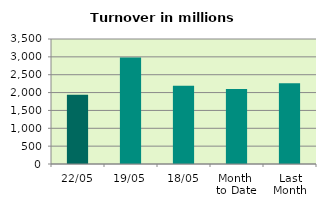
| Category | Series 0 |
|---|---|
| 22/05 | 1937.063 |
| 19/05 | 2982.815 |
| 18/05 | 2189.479 |
| Month 
to Date | 2103.117 |
| Last
Month | 2261.282 |